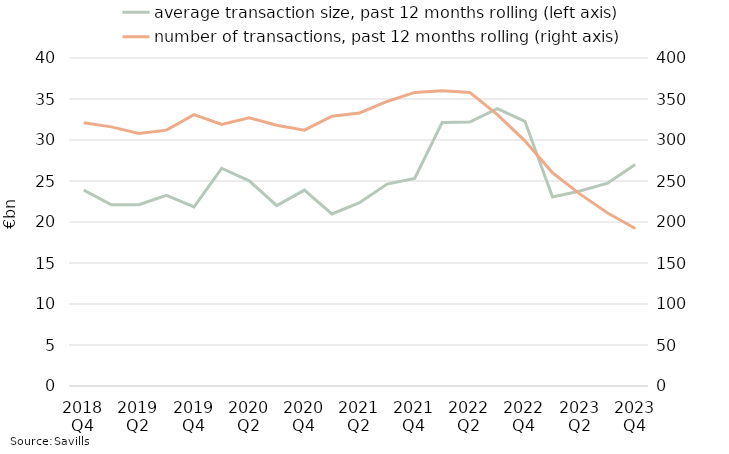
| Category | average transaction size, past 12 months rolling (left axis) |
|---|---|
| 2018 Q4 | 23884098.101 |
| 2019 Q1 | 22105124.01 |
| 2019 Q2 | 22110130.055 |
| 2019 Q3 | 23257657.317 |
| 2019 Q4 | 21833099.458 |
| 2020 Q1 | 26554041.295 |
| 2020 Q2 | 25017877.246 |
| 2020 Q3 | 21991349.382 |
| 2020 Q4 | 23889080.229 |
| 2021 Q1 | 20976068.951 |
| 2021 Q2 | 22349608.85 |
| 2021 Q3 | 24626788.79 |
| 2021 Q4 | 25303700.237 |
| 2022 Q1 | 32140480.875 |
| 2022 Q2 | 32185530.279 |
| 2022 Q3 | 33827730.084 |
| 2022 Q4 | 32280961.371 |
| 2023 Q1 | 23057535.711 |
| 2023 Q2 | 23785187.867 |
| 2023 Q3 | 24735065.042 |
| 2023 Q4 | 27021627.953 |